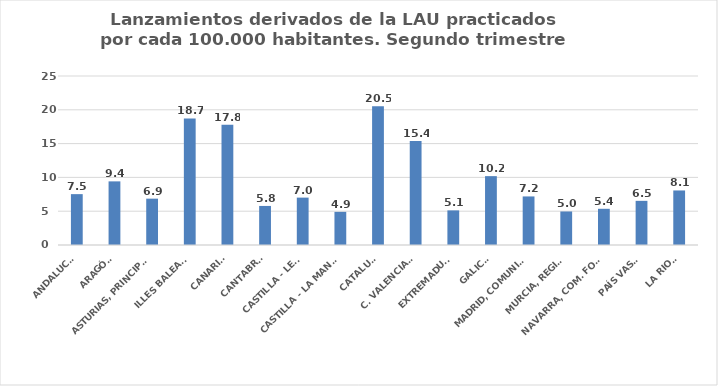
| Category | Series 0 |
|---|---|
| ANDALUCÍA | 7.524 |
| ARAGÓN | 9.412 |
| ASTURIAS, PRINCIPADO | 6.855 |
| ILLES BALEARS | 18.728 |
| CANARIAS | 17.805 |
| CANTABRIA | 5.777 |
| CASTILLA - LEÓN | 7.009 |
| CASTILLA - LA MANCHA | 4.902 |
| CATALUÑA | 20.521 |
| C. VALENCIANA | 15.388 |
| EXTREMADURA | 5.122 |
| GALICIA | 10.186 |
| MADRID, COMUNIDAD | 7.184 |
| MURCIA, REGIÓN | 4.959 |
| NAVARRA, COM. FORAL | 5.356 |
| PAÍS VASCO | 6.532 |
| LA RIOJA | 8.068 |